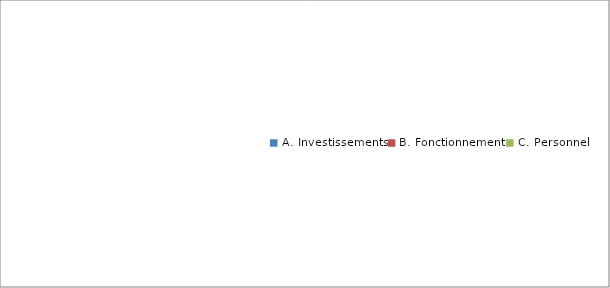
| Category | Series 0 |
|---|---|
| A. Investissements | 0 |
| B. Fonctionnement | 0 |
| C. Personnel | 0 |